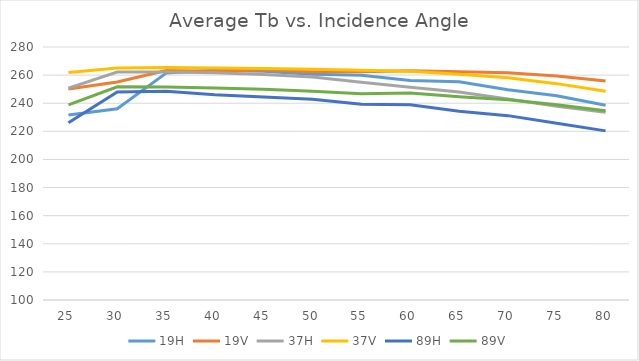
| Category | 19H | 19V | 37H | 37V | 89H | 89V |
|---|---|---|---|---|---|---|
| 25.0 | 231.642 | 250.194 | 250.784 | 261.932 | 226.178 | 238.772 |
| 30.0 | 236.11 | 255.102 | 262.145 | 264.99 | 247.983 | 251.715 |
| 35.0 | 261.413 | 263.28 | 262.143 | 265.441 | 248.592 | 251.602 |
| 40.0 | 263.392 | 262.706 | 261.594 | 265.019 | 245.961 | 250.861 |
| 45.0 | 262.782 | 263.774 | 260.397 | 264.703 | 244.486 | 249.882 |
| 50.0 | 260.537 | 262.437 | 258.631 | 264.106 | 242.755 | 248.6 |
| 55.0 | 259.958 | 262.446 | 254.879 | 263.415 | 239.218 | 246.684 |
| 60.0 | 256.18 | 263.064 | 251.316 | 262.686 | 238.842 | 247.318 |
| 65.0 | 255.278 | 262.337 | 247.919 | 260.604 | 234.367 | 244.668 |
| 70.0 | 249.609 | 261.692 | 242.957 | 258.129 | 231.164 | 242.517 |
| 75.0 | 245.293 | 259.301 | 237.809 | 253.934 | 225.76 | 238.978 |
| 80.0 | 238.508 | 255.795 | 233.534 | 248.558 | 220.325 | 234.58 |